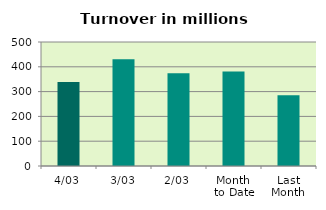
| Category | Series 0 |
|---|---|
| 4/03 | 339.159 |
| 3/03 | 430.896 |
| 2/03 | 373.638 |
| Month 
to Date | 381.231 |
| Last
Month | 285.08 |